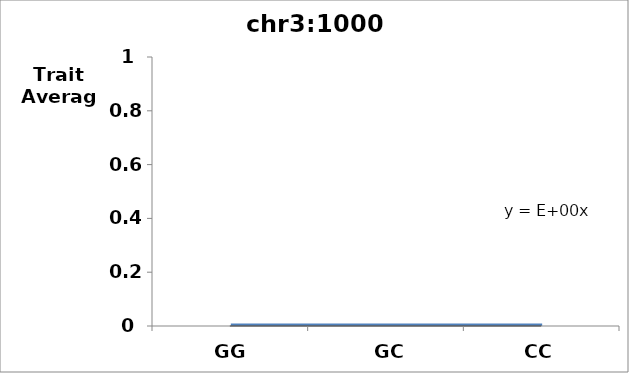
| Category | Score |
|---|---|
| GG | 0 |
| GC | 0 |
| CC | 0 |